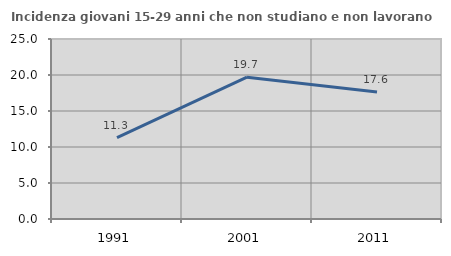
| Category | Incidenza giovani 15-29 anni che non studiano e non lavorano  |
|---|---|
| 1991.0 | 11.304 |
| 2001.0 | 19.697 |
| 2011.0 | 17.647 |